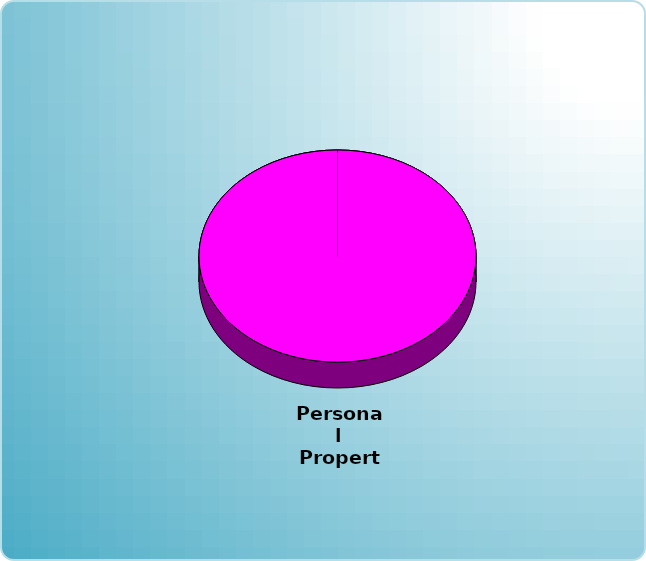
| Category | Series 0 |
|---|---|
| Cash | 0 |
| Bonds | 0 |
| Muni Bond | 0 |
| Hybrid bond | 0 |
| Value | 0 |
| Growth | 0 |
| Small-Cap | 0 |
| Tangibles | 0 |
| International | 0 |
| Personal Property | 50000 |
| Miscellaneous | 0 |